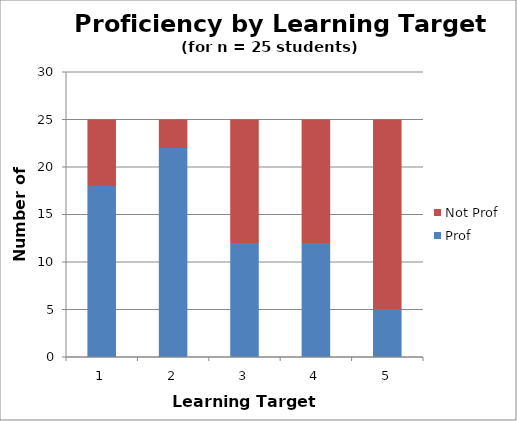
| Category | Prof | Not Prof |
|---|---|---|
| 1.0 | 18 | 7 |
| 2.0 | 22 | 3 |
| 3.0 | 12 | 13 |
| 4.0 | 12 | 13 |
| 5.0 | 5 | 20 |